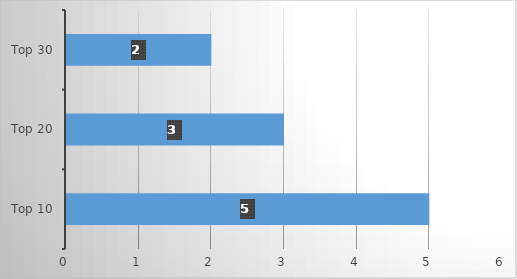
| Category | Series 0 |
|---|---|
| Top 10 | 5 |
| Top 20 | 3 |
| Top 30 | 2 |